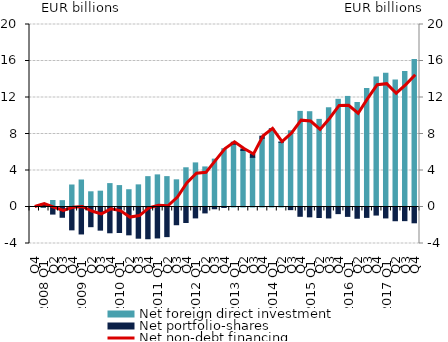
| Category | Net foreign direct investment | Net portfolio-shares |
|---|---|---|
| Q4 | 0 | 0 |
| 2008 Q1 | -0.03 | 0.352 |
| Q2 | 0.714 | -0.777 |
| Q3 | 0.698 | -1.126 |
| Q4 | 2.411 | -2.504 |
| 2009 Q1 | 2.958 | -2.955 |
| Q2 | 1.667 | -2.158 |
| Q3 | 1.734 | -2.537 |
| Q4 | 2.564 | -2.826 |
| 2010 Q1 | 2.346 | -2.796 |
| Q2 | 1.892 | -3.052 |
| Q3 | 2.426 | -3.419 |
| Q4 | 3.326 | -3.478 |
| 2011 Q1 | 3.52 | -3.392 |
| Q2 | 3.329 | -3.246 |
| Q3 | 2.978 | -1.944 |
| Q4 | 4.298 | -1.698 |
| 2012 Q1 | 4.833 | -1.195 |
| Q2 | 4.392 | -0.648 |
| Q3 | 5.245 | -0.193 |
| Q4 | 6.392 | -0.051 |
| 2013 Q1 | 6.878 | 0.215 |
| Q2 | 6.196 | 0.164 |
| Q3 | 5.441 | 0.318 |
| Q4 | 7.53 | 0.23 |
| 2014 Q1 | 8.538 | 0.023 |
| Q2 | 7.091 | 0.025 |
| Q3 | 8.351 | -0.291 |
| Q4 | 10.478 | -1.019 |
| 2015 Q1 | 10.442 | -1.077 |
| Q2 | 9.601 | -1.153 |
| Q3 | 10.875 | -1.2 |
| Q4 | 11.799 | -0.727 |
| 2016 Q1 | 12.118 | -1.028 |
| Q2 | 11.453 | -1.233 |
| Q3 | 12.988 | -1.139 |
| Q4 | 14.238 | -0.884 |
| 2017 Q1 | 14.659 | -1.197 |
| Q2 | 13.923 | -1.505 |
| Q3 | 14.856 | -1.496 |
| Q4 | 16.164 | -1.732 |